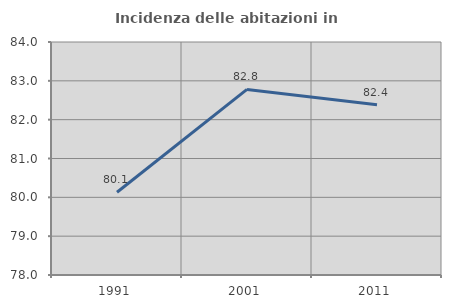
| Category | Incidenza delle abitazioni in proprietà  |
|---|---|
| 1991.0 | 80.131 |
| 2001.0 | 82.778 |
| 2011.0 | 82.381 |